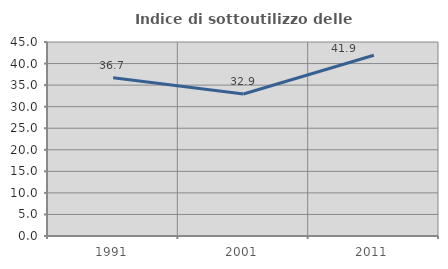
| Category | Indice di sottoutilizzo delle abitazioni  |
|---|---|
| 1991.0 | 36.709 |
| 2001.0 | 32.941 |
| 2011.0 | 41.935 |